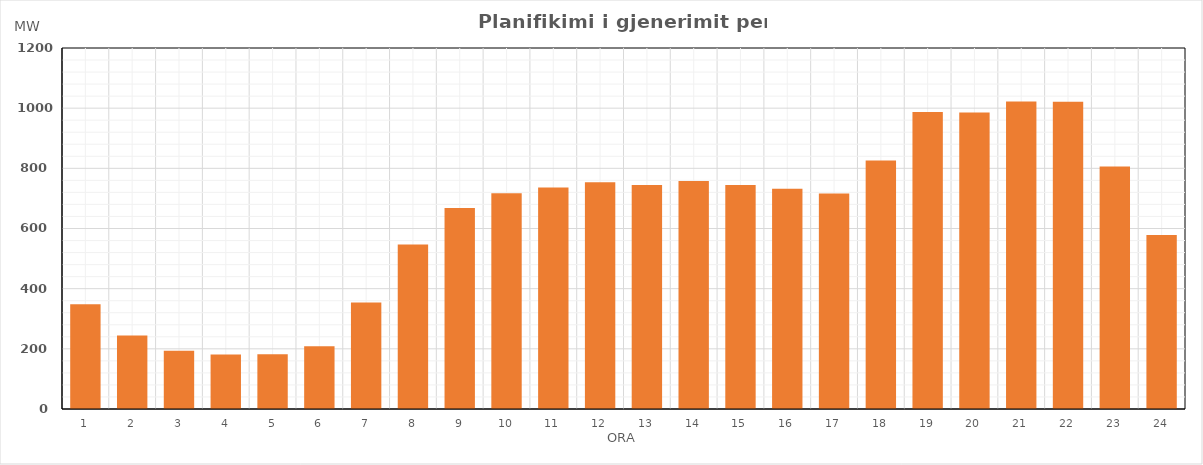
| Category | Max (MW) |
|---|---|
| 0 | 348.049 |
| 1 | 244.549 |
| 2 | 193.309 |
| 3 | 181.194 |
| 4 | 182.214 |
| 5 | 208.248 |
| 6 | 353.658 |
| 7 | 546.478 |
| 8 | 668.128 |
| 9 | 717.333 |
| 10 | 736.403 |
| 11 | 753.468 |
| 12 | 744.483 |
| 13 | 757.495 |
| 14 | 744.453 |
| 15 | 732.413 |
| 16 | 716.343 |
| 17 | 826.353 |
| 18 | 987.503 |
| 19 | 985.453 |
| 20 | 1022.553 |
| 21 | 1021.664 |
| 22 | 806.164 |
| 23 | 578.569 |